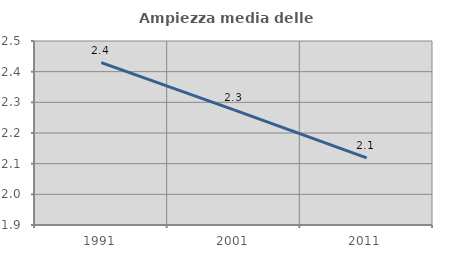
| Category | Ampiezza media delle famiglie |
|---|---|
| 1991.0 | 2.429 |
| 2001.0 | 2.276 |
| 2011.0 | 2.119 |